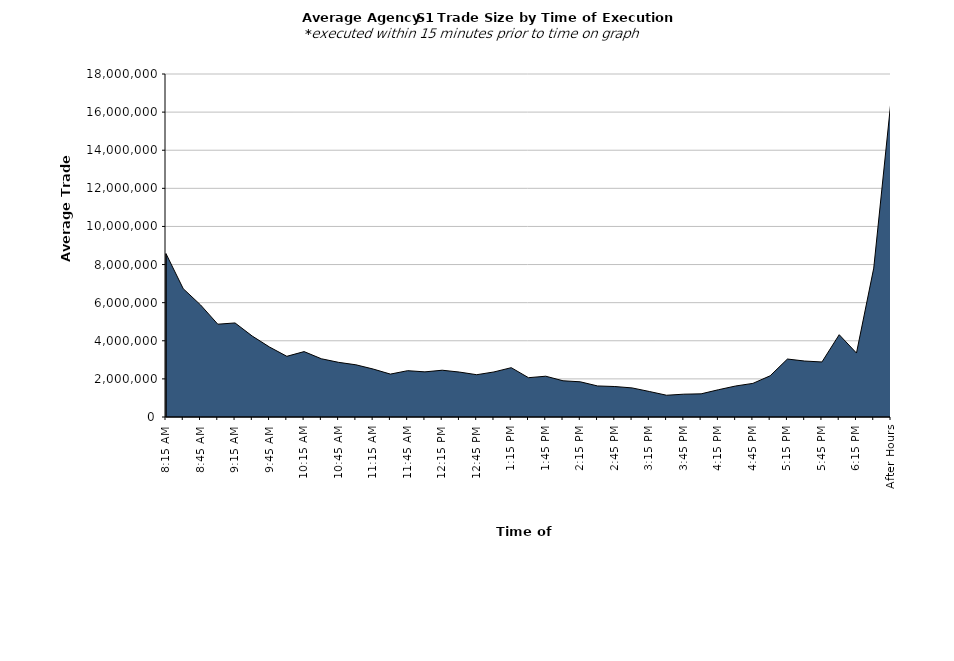
| Category | Series 0 |
|---|---|
| 8:15 AM | 8571455.663 |
| 8:30 AM | 6731735.388 |
| 8:45 AM | 5884021.739 |
| 9:00 AM | 4870384.364 |
| 9:15 AM | 4935555.68 |
| 9:30 AM | 4245342.578 |
| 9:45 AM | 3670313.08 |
| 10:00 AM | 3185281.288 |
| 10:15 AM | 3431643.144 |
| 10:30 AM | 3056761.902 |
| 10:45 AM | 2867902.871 |
| 11:00 AM | 2739710.375 |
| 11:15 AM | 2516542.311 |
| 11:30 AM | 2250968.2 |
| 11:45 AM | 2430927.836 |
| 12:00 PM | 2368162.849 |
| 12:15 PM | 2454561.554 |
| 12:30 PM | 2357680.312 |
| 12:45 PM | 2219479.58 |
| 1:00 PM | 2364598.372 |
| 1:15 PM | 2588075.012 |
| 1:30 PM | 2062795.871 |
| 1:45 PM | 2140322.238 |
| 2:00 PM | 1901177.841 |
| 2:15 PM | 1846720.068 |
| 2:30 PM | 1630021.88 |
| 2:45 PM | 1599303.581 |
| 3:00 PM | 1526350.226 |
| 3:15 PM | 1338515.49 |
| 3:30 PM | 1141828.81 |
| 3:45 PM | 1197683.035 |
| 4:00 PM | 1215618.532 |
| 4:15 PM | 1430391.192 |
| 4:30 PM | 1627519.99 |
| 4:45 PM | 1764255.74 |
| 5:00 PM | 2162369.504 |
| 5:15 PM | 3041488.04 |
| 5:30 PM | 2936921.88 |
| 5:45 PM | 2887301.877 |
| 6:00 PM | 4319225.806 |
| 6:15 PM | 3355446.732 |
| 6:30 PM | 7813809.524 |
| After Hours | 16612216.78 |